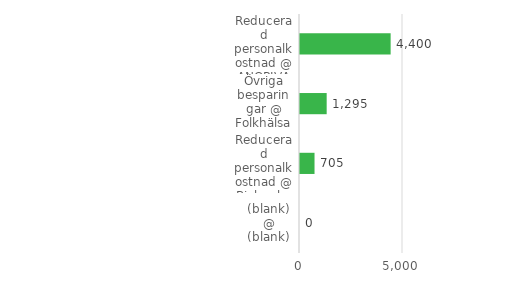
| Category | Summa |
|---|---|
| (blank) @ (blank) | 0 |
| Reducerad personalkostnad @ Biobanken Norr | 705 |
| Övriga besparingar @ Folkhälsa | 1295 |
| Reducerad personalkostnad @ ANOPIVA | 4400 |